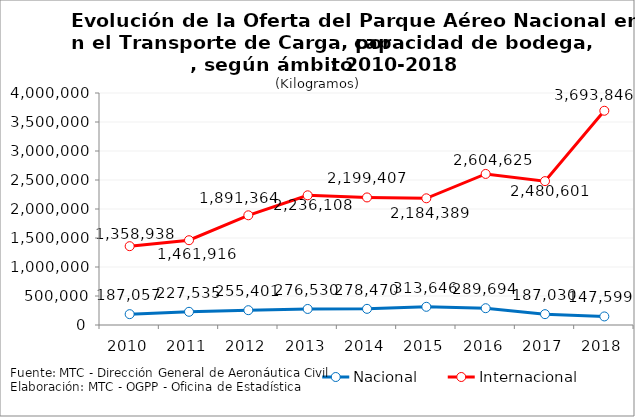
| Category | Nacional | Internacional |
|---|---|---|
| 2010.0 | 187057 | 1358938 |
| 2011.0 | 227535 | 1461916 |
| 2012.0 | 255401 | 1891364 |
| 2013.0 | 276530 | 2236108 |
| 2014.0 | 278470 | 2199407 |
| 2015.0 | 313646 | 2184389 |
| 2016.0 | 289694 | 2604625 |
| 2017.0 | 187030.18 | 2480601.38 |
| 2018.0 | 147598.5 | 3693846.37 |